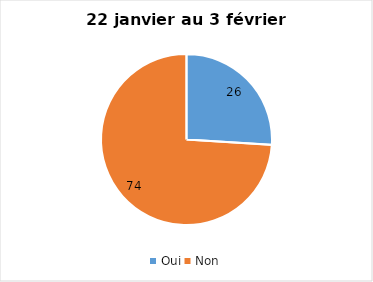
| Category | Series 0 |
|---|---|
| Oui | 26 |
| Non | 74 |